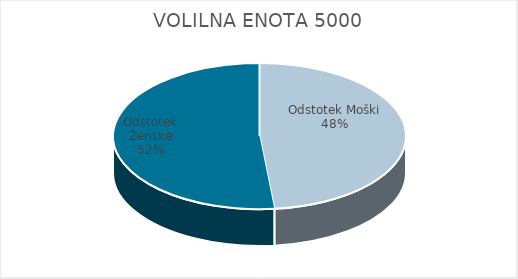
| Category | VOLILNA ENOTA 5000 | #REF! | Slovenija skupaj |
|---|---|---|---|
| Odstotek Moški | 19.54 |  | 19.85 |
| Odstotek Ženske | 20.84 |  | 21.47 |